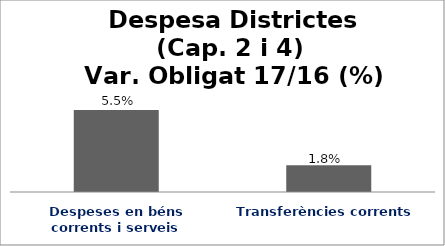
| Category | Series 0 |
|---|---|
| Despeses en béns corrents i serveis | 0.055 |
| Transferències corrents | 0.018 |